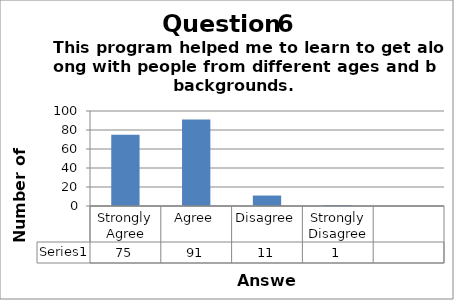
| Category | Series 0 |
|---|---|
| Strongly Agree | 75 |
| Agree | 91 |
| Disagree | 11 |
| Strongly Disagree | 1 |